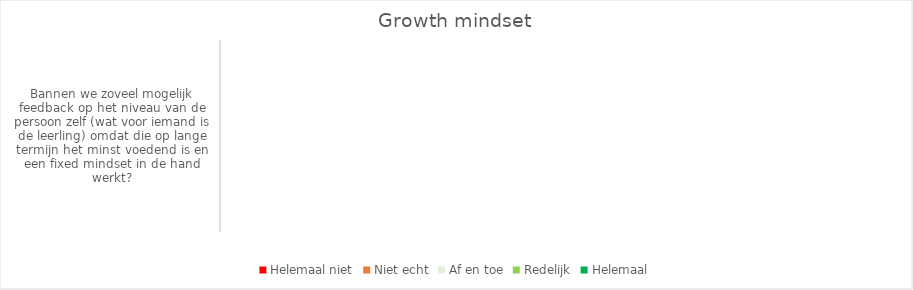
| Category | Helemaal niet | Niet echt | Af en toe | Redelijk | Helemaal |
|---|---|---|---|---|---|
| Bannen we zoveel mogelijk feedback op het niveau van de persoon zelf (wat voor iemand is de leerling) omdat die op lange termijn het minst voedend is en een fixed mindset in de hand werkt? | 0 | 0 | 0 | 0 | 0 |